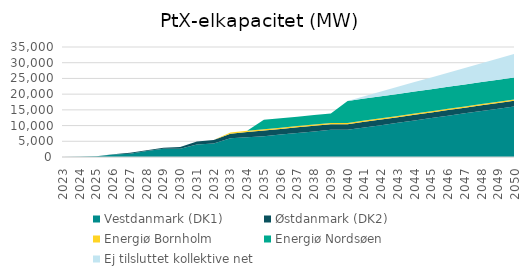
| Category | Vestdanmark (DK1) | Østdanmark (DK2) | Energiø Bornholm | Energiø Nordsøen | Ej tilsluttet kollektive net |
|---|---|---|---|---|---|
| 2023.0 | 5 | 0 | 0 | 0 | 0 |
| 2024.0 | 109 | 0 | 0 | 0 | 0 |
| 2025.0 | 222 | 31 | 0 | 0 | 0 |
| 2026.0 | 794 | 81 | 0 | 0 | 0 |
| 2027.0 | 1051.5 | 278 | 0 | 0 | 0 |
| 2028.0 | 1901 | 278 | 0 | 0 | 0 |
| 2029.0 | 2625.5 | 278 | 0 | 0 | 0 |
| 2030.0 | 2625.5 | 538 | 0 | 0 | 0 |
| 2031.0 | 3982 | 948 | 0 | 0 | 0 |
| 2032.0 | 4332 | 1098 | 0 | 0 | 0 |
| 2033.0 | 5932 | 1498 | 400 | 0 | 0 |
| 2034.0 | 6282 | 1648 | 400 | 0 | 0 |
| 2035.0 | 6632 | 1798 | 400 | 3000 | 0 |
| 2036.0 | 7132 | 1798 | 400 | 3000 | 0 |
| 2037.0 | 7632 | 1798 | 400 | 3000 | 0 |
| 2038.0 | 8132 | 1798 | 400 | 3000 | 0 |
| 2039.0 | 8632 | 1798 | 400 | 3000 | 0 |
| 2040.0 | 8632 | 1798 | 400 | 7000 | 0 |
| 2041.0 | 9382 | 1798 | 400 | 7000 | 750 |
| 2042.0 | 10132 | 1798 | 400 | 7000 | 1500 |
| 2043.0 | 10882 | 1798 | 400 | 7000 | 2250 |
| 2044.0 | 11632 | 1798 | 400 | 7000 | 3000 |
| 2045.0 | 12382 | 1798 | 400 | 7000 | 3750 |
| 2046.0 | 13132 | 1798 | 400 | 7000 | 4500 |
| 2047.0 | 13882 | 1798 | 400 | 7000 | 5250 |
| 2048.0 | 14632 | 1798 | 400 | 7000 | 6000 |
| 2049.0 | 15382 | 1798 | 400 | 7000 | 6750 |
| 2050.0 | 16132 | 1798 | 400 | 7000 | 7500 |